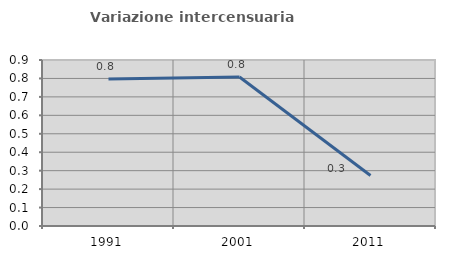
| Category | Variazione intercensuaria annua |
|---|---|
| 1991.0 | 0.797 |
| 2001.0 | 0.808 |
| 2011.0 | 0.274 |